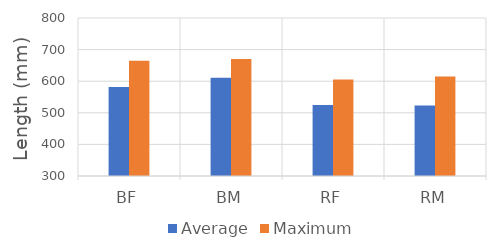
| Category | Average | Maximum |
|---|---|---|
| BF | 582 | 665 |
| BM | 611 | 670 |
| RF | 525 | 605 |
| RM | 523 | 615 |